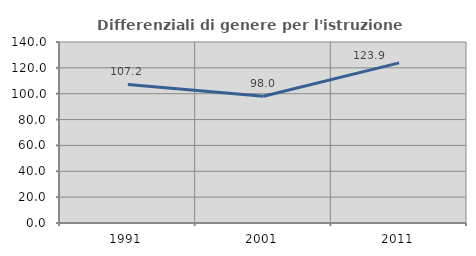
| Category | Differenziali di genere per l'istruzione superiore |
|---|---|
| 1991.0 | 107.179 |
| 2001.0 | 98.023 |
| 2011.0 | 123.851 |